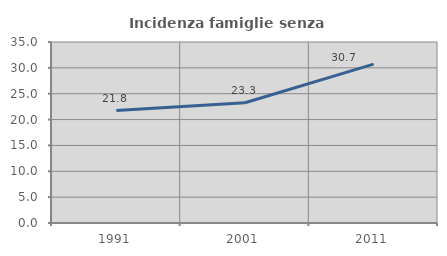
| Category | Incidenza famiglie senza nuclei |
|---|---|
| 1991.0 | 21.753 |
| 2001.0 | 23.25 |
| 2011.0 | 30.71 |